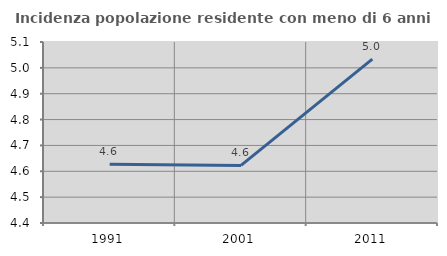
| Category | Incidenza popolazione residente con meno di 6 anni |
|---|---|
| 1991.0 | 4.627 |
| 2001.0 | 4.623 |
| 2011.0 | 5.034 |